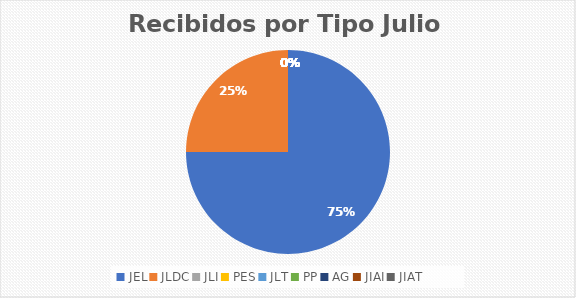
| Category | Series 0 |
|---|---|
| JEL | 6 |
| JLDC | 2 |
| JLI | 0 |
| PES | 0 |
| JLT | 0 |
| PP | 0 |
| AG | 0 |
| JIAI | 0 |
| JIAT | 0 |